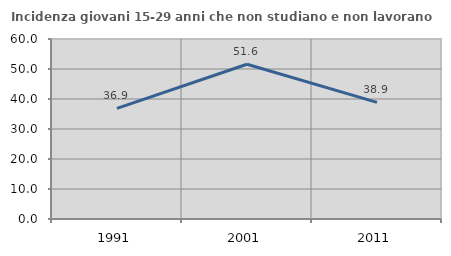
| Category | Incidenza giovani 15-29 anni che non studiano e non lavorano  |
|---|---|
| 1991.0 | 36.857 |
| 2001.0 | 51.588 |
| 2011.0 | 38.859 |